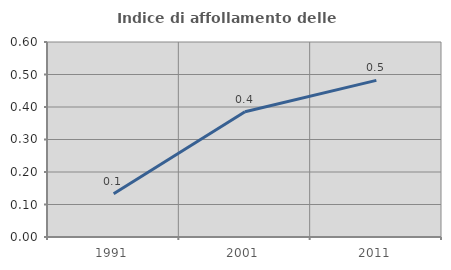
| Category | Indice di affollamento delle abitazioni  |
|---|---|
| 1991.0 | 0.133 |
| 2001.0 | 0.386 |
| 2011.0 | 0.482 |